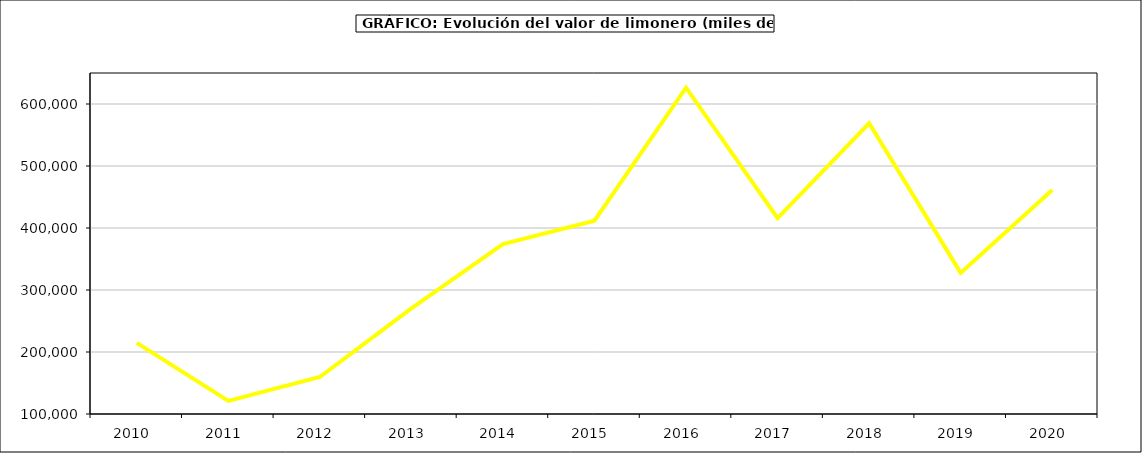
| Category | Valor |
|---|---|
| 2010.0 | 214653.894 |
| 2011.0 | 121030.951 |
| 2012.0 | 159689.894 |
| 2013.0 | 270510.614 |
| 2014.0 | 373950.238 |
| 2015.0 | 411737 |
| 2016.0 | 626329 |
| 2017.0 | 415897.996 |
| 2018.0 | 568828.291 |
| 2019.0 | 327602.422 |
| 2020.0 | 461310.053 |